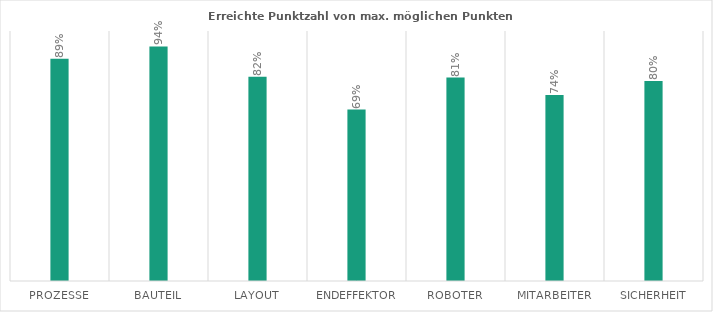
| Category | Series 0 |
|---|---|
| Prozesse | 0.889 |
| Bauteil | 0.938 |
| Layout | 0.817 |
| Endeffektor | 0.686 |
| Roboter | 0.814 |
| Mitarbeiter | 0.744 |
| Sicherheit | 0.8 |